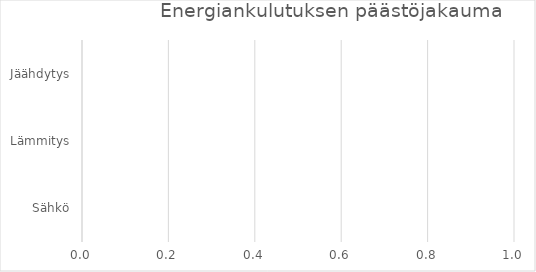
| Category | Infra-osion hiilijalanjälki, Hankinnat |
|---|---|
| IT/Laitteet | 0 |
| Huonekalut | 0 |
| Materiaalit | 0 |
| Siivous  | 0 |
| Muut hankinnat | 0 |